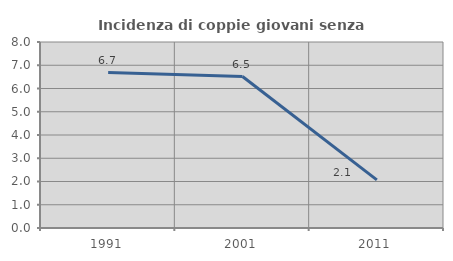
| Category | Incidenza di coppie giovani senza figli |
|---|---|
| 1991.0 | 6.688 |
| 2001.0 | 6.515 |
| 2011.0 | 2.069 |